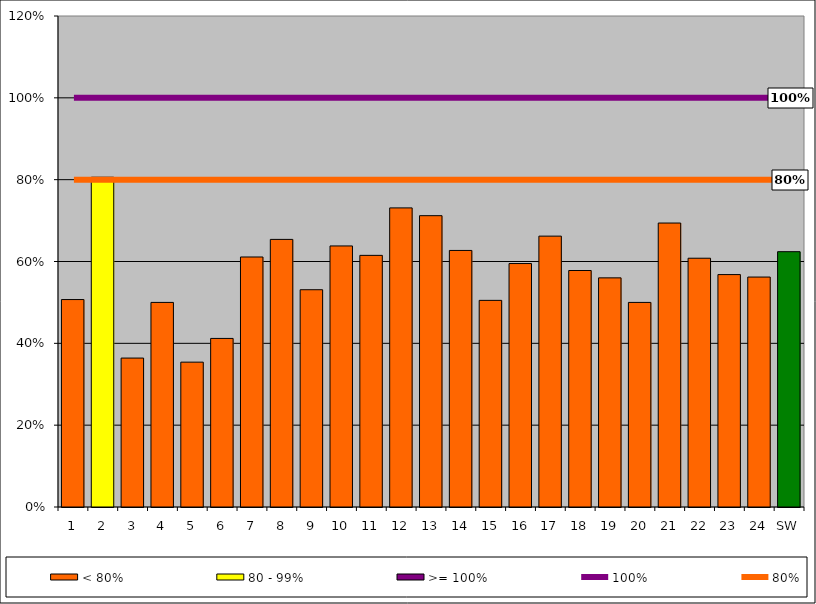
| Category | < 80% | 80 - 99% | >= 100% |
|---|---|---|---|
| 1 | 0.507 | 0 | 0 |
| 2 | 0 | 0.806 | 0 |
| 3 | 0.364 | 0 | 0 |
| 4 | 0.5 | 0 | 0 |
| 5 | 0.354 | 0 | 0 |
| 6 | 0.412 | 0 | 0 |
| 7 | 0.611 | 0 | 0 |
| 8 | 0.654 | 0 | 0 |
| 9 | 0.531 | 0 | 0 |
| 10 | 0.638 | 0 | 0 |
| 11 | 0.615 | 0 | 0 |
| 12 | 0.731 | 0 | 0 |
| 13 | 0.712 | 0 | 0 |
| 14 | 0.627 | 0 | 0 |
| 15 | 0.505 | 0 | 0 |
| 16 | 0.595 | 0 | 0 |
| 17 | 0.662 | 0 | 0 |
| 18 | 0.578 | 0 | 0 |
| 19 | 0.56 | 0 | 0 |
| 20 | 0.5 | 0 | 0 |
| 21 | 0.694 | 0 | 0 |
| 22 | 0.608 | 0 | 0 |
| 23 | 0.568 | 0 | 0 |
| 24 | 0.562 | 0 | 0 |
| SW | 0.624 | 0 | 0 |